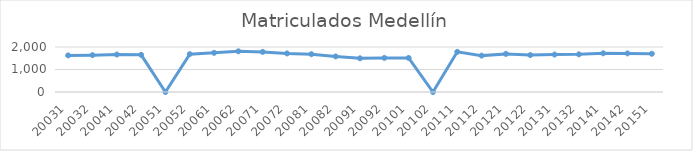
| Category | Matriculados Medellín |
|---|---|
| 20031 | 1627 |
| 20032 | 1638 |
| 20041 | 1666 |
| 20042 | 1653 |
| 20051 | 0 |
| 20052 | 1683 |
| 20061 | 1741 |
| 20062 | 1808 |
| 20071 | 1783 |
| 20072 | 1715 |
| 20081 | 1680 |
| 20082 | 1580 |
| 20091 | 1498 |
| 20092 | 1516 |
| 20101 | 1515 |
| 20102 | 0 |
| 20111 | 1785 |
| 20112 | 1617 |
| 20121 | 1694 |
| 20122 | 1641 |
| 20131 | 1664 |
| 20132 | 1675 |
| 20141 | 1720 |
| 20142 | 1716 |
| 20151 | 1700 |